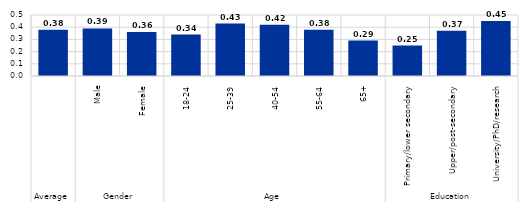
| Category | Series 0 |
|---|---|
| 0 | 0.38 |
| 1 | 0.39 |
| 2 | 0.36 |
| 3 | 0.34 |
| 4 | 0.43 |
| 5 | 0.42 |
| 6 | 0.38 |
| 7 | 0.29 |
| 8 | 0.25 |
| 9 | 0.37 |
| 10 | 0.45 |